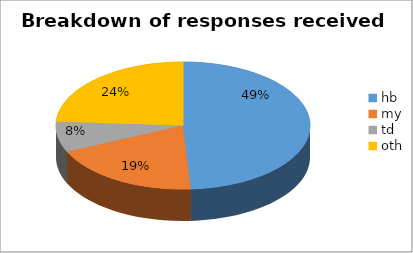
| Category | Series 0 |
|---|---|
| hb | 51 |
| my | 20 |
| td | 8 |
| oth | 25 |